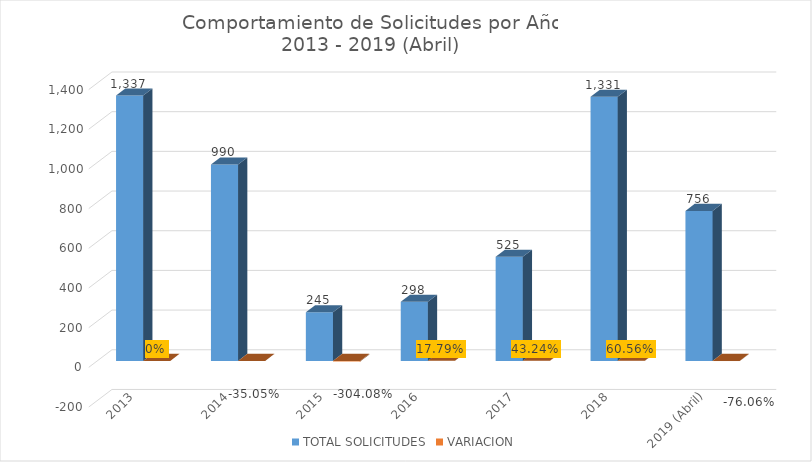
| Category | TOTAL SOLICITUDES | VARIACION |
|---|---|---|
| 2013 | 1337 | 0 |
| 2014 | 990 | -0.351 |
| 2015 | 245 | -3.041 |
| 2016 | 298 | 0.178 |
| 2017 | 525 | 0.432 |
| 2018 | 1331 | 0.606 |
| 2019 (Abril) | 756 | -0.761 |